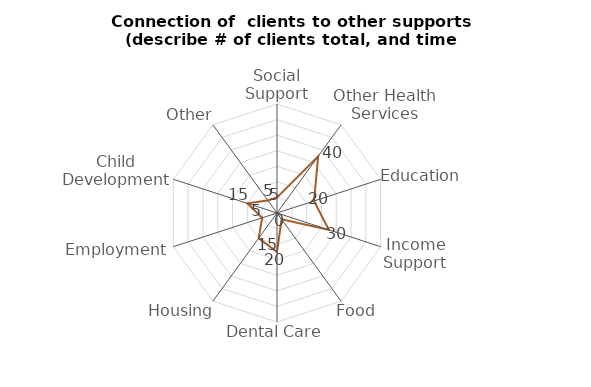
| Category | Series 0 |
|---|---|
| Social Support | 5 |
| Other Health Services | 40 |
| Education | 20 |
| Income Support | 30 |
| Food | 0 |
| Dental Care | 20 |
| Housing | 15 |
| Employment | 5 |
| Child Development | 15 |
| Other | 5 |